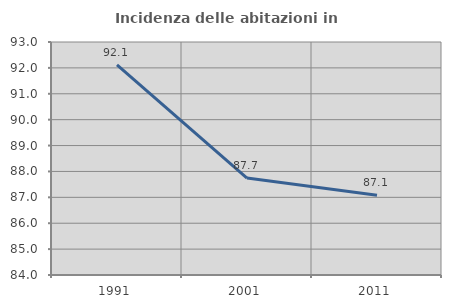
| Category | Incidenza delle abitazioni in proprietà  |
|---|---|
| 1991.0 | 92.113 |
| 2001.0 | 87.744 |
| 2011.0 | 87.079 |